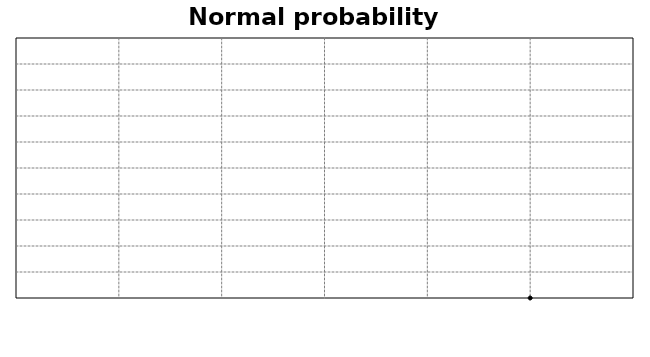
| Category | Series 0 |
|---|---|
| 12.0 | -11.628 |
| 12.0 | -3.488 |
| 13.0 | 1.082 |
| 13.0 | 4.396 |
| 13.0 | 7.052 |
| 14.0 | 9.299 |
| 15.0 | 11.264 |
| 16.0 | 13.025 |
| 17.0 | 14.63 |
| 17.0 | 16.112 |
| 19.0 | 17.495 |
| 22.0 | 18.796 |
| 22.0 | 20.03 |
| 22.0 | 21.206 |
| 25.0 | 22.332 |
| 25.0 | 23.417 |
| 25.0 | 24.465 |
| 26.0 | 25.481 |
| 26.0 | 26.47 |
| 27.0 | 27.434 |
| 28.0 | 28.377 |
| 28.0 | 29.302 |
| 28.0 | 30.21 |
| 29.0 | 31.105 |
| 29.0 | 31.987 |
| 30.0 | 32.86 |
| 31.0 | 33.724 |
| 34.0 | 34.581 |
| 34.0 | 35.432 |
| 34.0 | 36.28 |
| 34.0 | 37.125 |
| 36.0 | 37.968 |
| 36.0 | 38.812 |
| 36.0 | 39.657 |
| 37.0 | 40.504 |
| 37.0 | 41.356 |
| 38.0 | 42.213 |
| 40.0 | 43.077 |
| 41.0 | 43.949 |
| 41.0 | 44.832 |
| 42.0 | 45.726 |
| 45.0 | 46.635 |
| 46.0 | 47.559 |
| 47.0 | 48.503 |
| 47.0 | 49.467 |
| 48.0 | 50.455 |
| 49.0 | 51.471 |
| 51.0 | 52.519 |
| 51.0 | 53.604 |
| 51.0 | 54.731 |
| 52.0 | 55.907 |
| 52.0 | 57.14 |
| 53.0 | 58.442 |
| 53.0 | 59.825 |
| 55.0 | 61.307 |
| 56.0 | 62.911 |
| 56.0 | 64.672 |
| 57.0 | 66.638 |
| 57.0 | 68.884 |
| 58.0 | 71.54 |
| 59.0 | 74.855 |
| 100.0 | 79.424 |
| 145.0 | 87.565 |